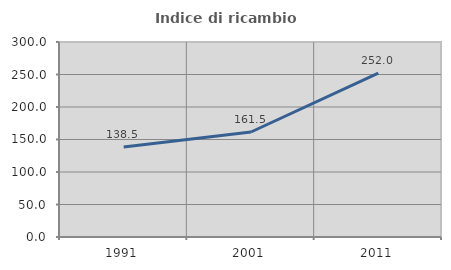
| Category | Indice di ricambio occupazionale  |
|---|---|
| 1991.0 | 138.462 |
| 2001.0 | 161.538 |
| 2011.0 | 252 |